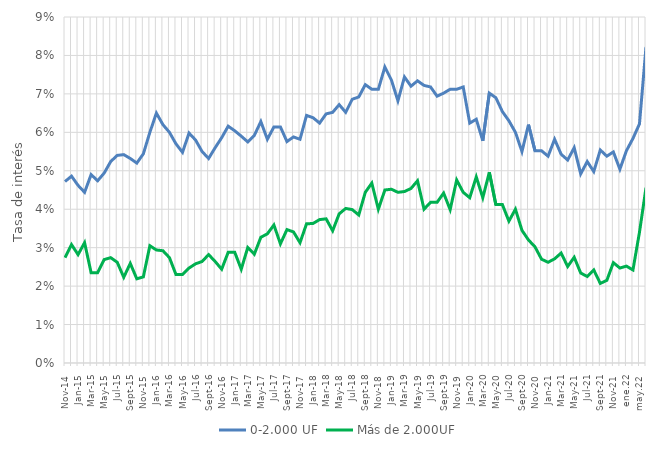
| Category | 0-2.000 UF | Más de 2.000UF |
|---|---|---|
| nov-14 | 0.047 | 0.027 |
| dic-14 | 0.049 | 0.031 |
| ene-15 | 0.046 | 0.028 |
| feb-15 | 0.044 | 0.031 |
| mar-15 | 0.049 | 0.024 |
| abr-15 | 0.047 | 0.024 |
| may-15 | 0.049 | 0.027 |
| jun-15 | 0.052 | 0.027 |
| jul-15 | 0.054 | 0.026 |
| ago-15 | 0.054 | 0.022 |
| sept-15 | 0.053 | 0.026 |
| oct-15 | 0.052 | 0.022 |
| nov-15 | 0.054 | 0.022 |
| dic-15 | 0.06 | 0.03 |
| ene-16 | 0.065 | 0.029 |
| feb-16 | 0.062 | 0.029 |
| mar-16 | 0.06 | 0.027 |
| abr-16 | 0.057 | 0.023 |
| may-16 | 0.055 | 0.023 |
| jun-16 | 0.06 | 0.025 |
| jul-16 | 0.058 | 0.026 |
| ago-16 | 0.055 | 0.026 |
| sept-16 | 0.053 | 0.028 |
| oct-16 | 0.056 | 0.026 |
| nov-16 | 0.059 | 0.024 |
| dic-16 | 0.062 | 0.029 |
| ene-17 | 0.06 | 0.029 |
| feb-17 | 0.059 | 0.024 |
| mar-17 | 0.058 | 0.03 |
| abr-17 | 0.059 | 0.028 |
| may-17 | 0.063 | 0.033 |
| jun-17 | 0.058 | 0.034 |
| jul-17 | 0.061 | 0.036 |
| ago-17 | 0.061 | 0.031 |
| sept-17 | 0.058 | 0.035 |
| oct-17 | 0.059 | 0.034 |
| nov-17 | 0.058 | 0.031 |
| dic-17 | 0.064 | 0.036 |
| ene-18 | 0.064 | 0.036 |
| feb-18 | 0.062 | 0.037 |
| mar-18 | 0.065 | 0.038 |
| abr-18 | 0.065 | 0.034 |
| may-18 | 0.067 | 0.039 |
| jun-18 | 0.065 | 0.04 |
| jul-18 | 0.069 | 0.04 |
| ago-18 | 0.069 | 0.038 |
| sept-18 | 0.072 | 0.044 |
| oct-18 | 0.071 | 0.047 |
| nov-18 | 0.071 | 0.04 |
| dic-18 | 0.077 | 0.045 |
| ene-19 | 0.074 | 0.045 |
| feb-19 | 0.068 | 0.044 |
| mar-19 | 0.074 | 0.045 |
| abr-19 | 0.072 | 0.045 |
| may-19 | 0.073 | 0.047 |
| jun-19 | 0.072 | 0.04 |
| jul-19 | 0.072 | 0.042 |
| ago-19 | 0.069 | 0.042 |
| sept-19 | 0.07 | 0.044 |
| oct-19 | 0.071 | 0.04 |
| nov-19 | 0.071 | 0.048 |
| dic-19 | 0.072 | 0.044 |
| ene-20 | 0.062 | 0.043 |
| feb-20 | 0.063 | 0.048 |
| mar-20 | 0.058 | 0.043 |
| abr-20 | 0.07 | 0.05 |
| may-20 | 0.069 | 0.041 |
| jun-20 | 0.065 | 0.041 |
| jul-20 | 0.063 | 0.037 |
| ago-20 | 0.06 | 0.04 |
| sept-20 | 0.055 | 0.034 |
| oct-20 | 0.062 | 0.032 |
| nov-20 | 0.055 | 0.03 |
| dic-20 | 0.055 | 0.027 |
| ene-21 | 0.054 | 0.026 |
| feb-21 | 0.058 | 0.027 |
| mar-21 | 0.054 | 0.029 |
| abr-21 | 0.053 | 0.025 |
| may-21 | 0.056 | 0.028 |
| jun-21 | 0.049 | 0.023 |
| jul-21 | 0.052 | 0.022 |
| ago-21 | 0.05 | 0.024 |
| sept-21 | 0.055 | 0.021 |
| oct-21 | 0.054 | 0.022 |
| nov-21 | 0.055 | 0.026 |
| dic-21 | 0.05 | 0.025 |
| ene.22 | 0.055 | 0.025 |
| feb-22 | 0.058 | 0.024 |
| may.22 | 0.062 | 0.034 |
| juL.22 | 0.082 | 0.046 |